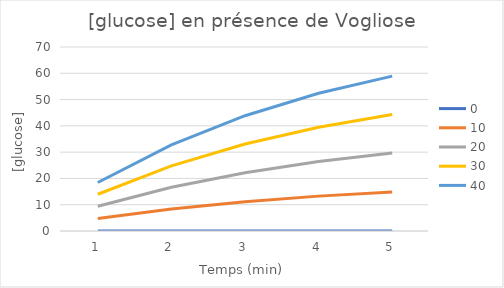
| Category | 0 | 10 | 20 | 30 | 40 |
|---|---|---|---|---|---|
| 1.0 | 0 | 4.752 | 9.412 | 13.981 | 18.462 |
| 2.0 | 0 | 8.384 | 16.642 | 24.777 | 32.79 |
| 3.0 | 0 | 11.156 | 22.183 | 33.084 | 43.859 |
| 4.0 | 0 | 13.269 | 26.422 | 39.458 | 52.379 |
| 5.0 | 0 | 14.879 | 29.659 | 44.338 | 58.918 |